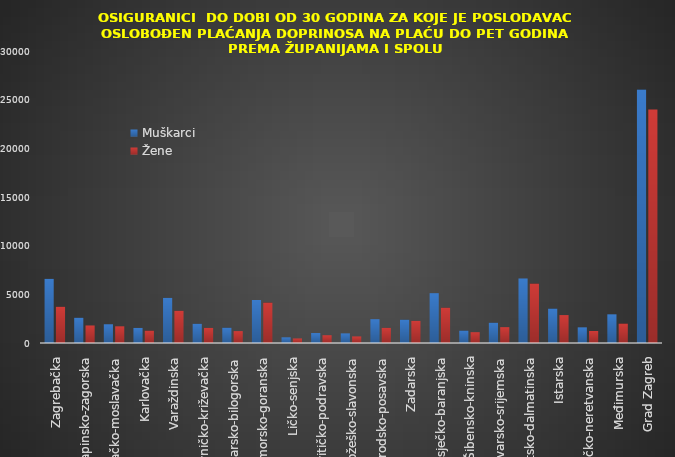
| Category | Muškarci | Žene |
|---|---|---|
| Zagrebačka | 6590 | 3723 |
| Krapinsko-zagorska | 2596 | 1801 |
| Sisačko-moslavačka | 1925 | 1715 |
| Karlovačka | 1548 | 1272 |
| Varaždinska | 4635 | 3313 |
| Koprivničko-križevačka | 1976 | 1553 |
| Bjelovarsko-bilogorska | 1575 | 1222 |
| Primorsko-goranska | 4416 | 4158 |
| Ličko-senjska | 584 | 467 |
| Virovitičko-podravska | 1023 | 799 |
| Požeško-slavonska | 989 | 677 |
| Brodsko-posavska | 2447 | 1558 |
| Zadarska | 2398 | 2276 |
| Osječko-baranjska | 5118 | 3629 |
| Šibensko-kninska | 1280 | 1111 |
| Vukovarsko-srijemska | 2086 | 1628 |
| Splitsko-dalmatinska | 6629 | 6108 |
| Istarska | 3539 | 2868 |
| Dubrovačko-neretvanska | 1609 | 1236 |
| Međimurska | 2945 | 1998 |
| Grad Zagreb | 26032 | 23989 |